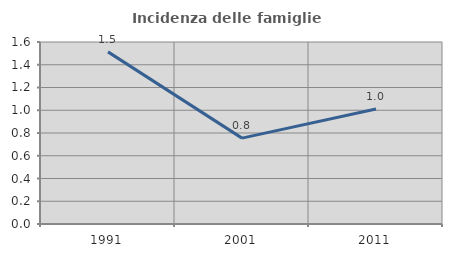
| Category | Incidenza delle famiglie numerose |
|---|---|
| 1991.0 | 1.513 |
| 2001.0 | 0.755 |
| 2011.0 | 1.011 |